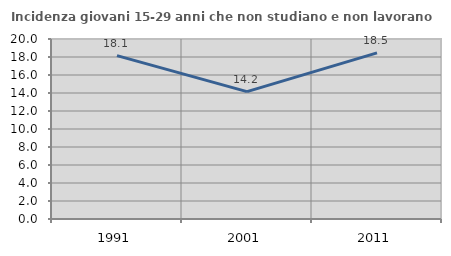
| Category | Incidenza giovani 15-29 anni che non studiano e non lavorano  |
|---|---|
| 1991.0 | 18.149 |
| 2001.0 | 14.157 |
| 2011.0 | 18.456 |